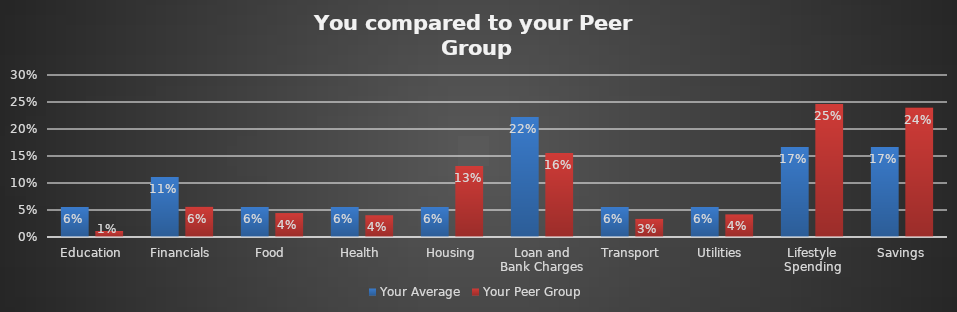
| Category | Your Average | Your Peer Group |
|---|---|---|
| Education | 0.056 | 0.011 |
| Financials | 0.111 | 0.056 |
| Food | 0.056 | 0.044 |
| Health | 0.056 | 0.04 |
| Housing | 0.056 | 0.131 |
| Loan and Bank Charges | 0.222 | 0.155 |
| Transport | 0.056 | 0.034 |
| Utilities | 0.056 | 0.042 |
| Lifestyle Spending | 0.167 | 0.246 |
| Savings | 0.167 | 0.24 |